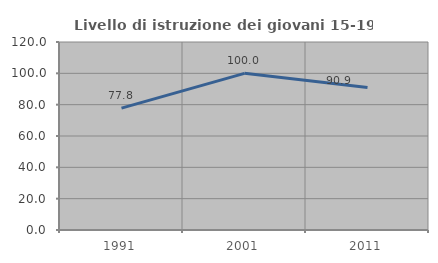
| Category | Livello di istruzione dei giovani 15-19 anni |
|---|---|
| 1991.0 | 77.778 |
| 2001.0 | 100 |
| 2011.0 | 90.909 |